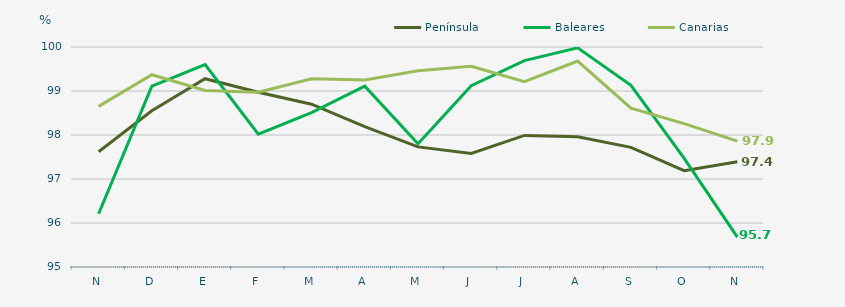
| Category | Península | Baleares | Canarias |
|---|---|---|---|
| N | 97.62 | 96.21 | 98.65 |
| D | 98.55 | 99.11 | 99.37 |
| E | 99.28 | 99.6 | 99.01 |
| F | 98.97 | 98.02 | 98.97 |
| M | 98.7 | 98.51 | 99.28 |
| A | 98.19 | 99.11 | 99.25 |
| M | 97.73 | 97.8 | 99.46 |
| J | 97.58 | 99.12 | 99.56 |
| J | 97.99 | 99.69 | 99.21 |
| A | 97.96 | 99.98 | 99.68 |
| S | 97.72 | 99.13 | 98.61 |
| O | 97.19 | 97.47 | 98.26 |
| N | 97.39 | 95.68 | 97.86 |